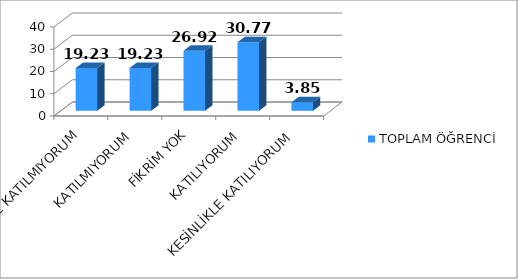
| Category | TOPLAM ÖĞRENCİ |
|---|---|
| KESİNLİKLE KATILMIYORUM | 19.23 |
| KATILMIYORUM | 19.23 |
| FİKRİM YOK | 26.92 |
| KATILIYORUM | 30.77 |
| KESİNLİKLE KATILIYORUM | 3.85 |